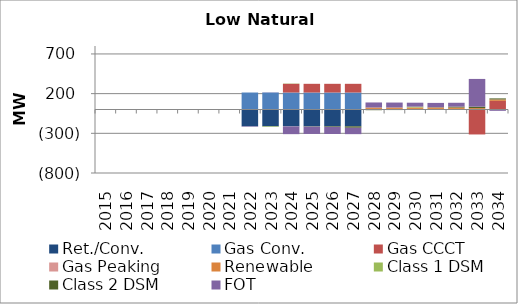
| Category | Ret./Conv. | Gas Conv. | Gas CCCT | Gas Peaking | Renewable | Class 1 DSM | Class 2 DSM | FOT |
|---|---|---|---|---|---|---|---|---|
| 2015.0 | 0 | 0 | 0 | 0 | 0 | 0 | 3.6 | -1.919 |
| 2016.0 | 0 | 0 | 0 | 0 | 0 | 0 | 3.61 | -1.925 |
| 2017.0 | 0 | 0 | 0 | 0 | 0 | 0 | 3.6 | -1.919 |
| 2018.0 | 0 | 0 | 0 | 0 | 0 | 0 | 3.49 | -1.877 |
| 2019.0 | 0 | 0 | 0 | 0 | 0 | 0 | 3.48 | -4.143 |
| 2020.0 | 0 | 0 | 0 | 0 | 0 | 0 | 1.57 | -4 |
| 2021.0 | 0 | 0 | 0 | 0 | 0 | 0 | 0.48 | -3.592 |
| 2022.0 | -212 | 214 | 0 | 0 | 0 | 0 | 0.29 | -5.345 |
| 2023.0 | -212 | 214 | 0 | 0 | 0 | -7.15 | -0.21 | 2.113 |
| 2024.0 | -212 | 214 | 109.6 | 0 | 0 | 3.45 | -0.92 | -97.607 |
| 2025.0 | -212 | 214 | 109.6 | 0 | 0 | 0.05 | -4.28 | -91.496 |
| 2026.0 | -212 | 214 | 109.6 | 0 | 0 | -0.02 | -7.5 | -88.837 |
| 2027.0 | -212 | 214 | 109.6 | 0 | 0 | -0.02 | -17.98 | -80.51 |
| 2028.0 | 0 | 0 | 7.2 | 0 | 18 | -0.02 | -8.71 | 63.459 |
| 2029.0 | 0 | 0 | 7.2 | 0 | 18 | -0.02 | -7.01 | 62.355 |
| 2030.0 | 0 | 0 | 7.2 | 0 | 18 | 10.6 | -4.43 | 49.921 |
| 2031.0 | 0 | 0 | 7.2 | 0 | 18 | 0 | 3.23 | 54.657 |
| 2032.0 | 0 | 0 | 7.2 | 0 | 18 | 0 | 10.82 | 48.789 |
| 2033.0 | 0 | 0 | -314.4 | 0 | 18 | 0 | 18.11 | 349.064 |
| 2034.0 | 0 | 0 | 108.6 | 0 | 18 | -1.35 | 13.21 | -15.404 |